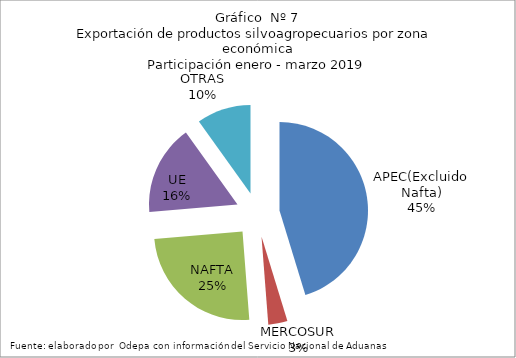
| Category | Series 0 |
|---|---|
| APEC(Excluido Nafta) | 7566406.523 |
| MERCOSUR | 584939.271 |
| NAFTA | 4156365.86 |
| UE | 2749658.462 |
| OTRAS | 1655524.884 |